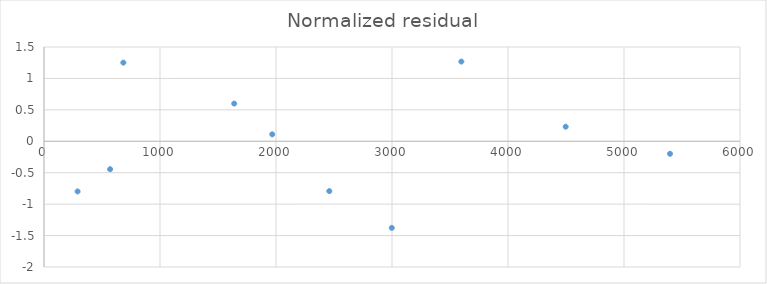
| Category | Normalized residual |
|---|---|
| 2998.140930281641 | -1.378 |
| 1639.6388306211652 | 0.6 |
| 569.9586315962957 | -0.444 |
| 289.6301658775817 | -0.798 |
| 3597.769116337969 | 1.268 |
| 1967.566596745398 | 0.111 |
| 683.950357915555 | 1.251 |
| 4497.211395422462 | 0.232 |
| 2459.458245931748 | -0.792 |
| 5396.653674506954 | -0.199 |